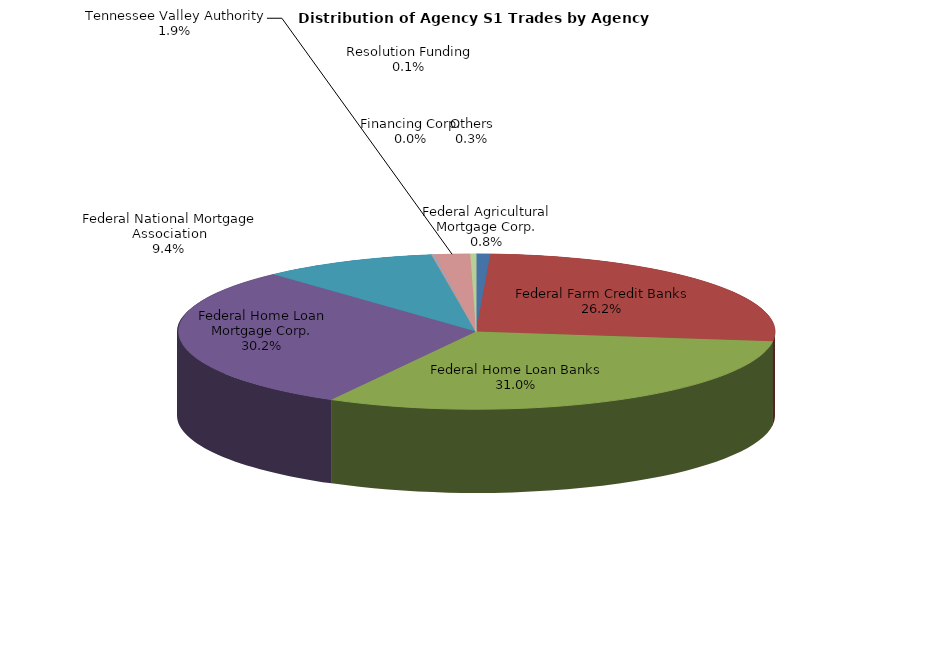
| Category | Series 0 |
|---|---|
| Federal Agricultural Mortgage Corp. | 45.252 |
| Federal Farm Credit Banks | 1549.036 |
| Federal Home Loan Banks | 1830.948 |
| Federal Home Loan Mortgage Corp. | 1781.516 |
| Federal National Mortgage Association | 557.44 |
| Financing Corp. | 0 |
| Resolution Funding | 7.56 |
| Tennessee Valley Authority | 114.14 |
| Others | 18.144 |